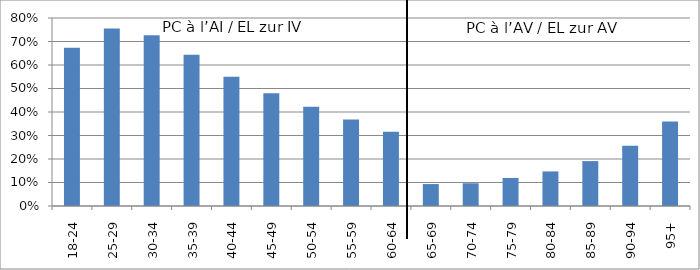
| Category | PC à l’AI / EL zur IV PC à l’AV / EL zur AV |
|---|---|
| 18-24 | 0.673 |
| 25-29 | 0.756 |
| 30-34 | 0.727 |
| 35-39 | 0.643 |
| 40-44 | 0.55 |
| 45-49 | 0.48 |
| 50-54 | 0.422 |
| 55-59 | 0.368 |
| 60-64 | 0.316 |
| 65-69 | 0.093 |
| 70-74 | 0.097 |
| 75-79 | 0.119 |
| 80-84 | 0.147 |
| 85-89 | 0.191 |
| 90-94 | 0.256 |
| 95+ | 0.359 |